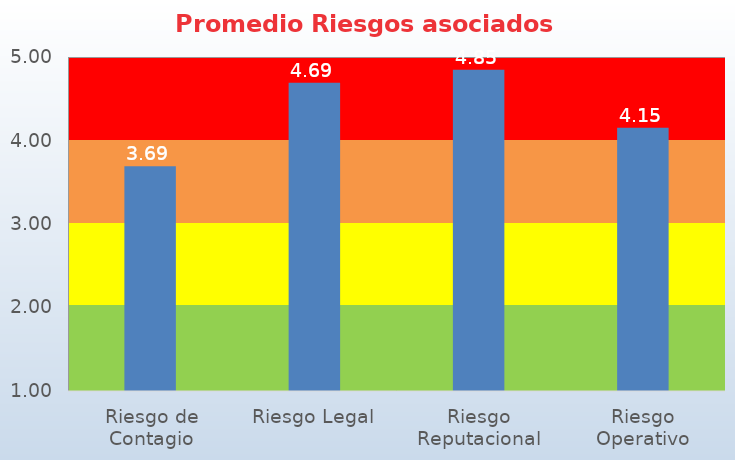
| Category | Promedio |
|---|---|
| Riesgo de Contagio | 3.692 |
| Riesgo Legal | 4.692 |
| Riesgo Reputacional | 4.846 |
| Riesgo Operativo | 4.154 |